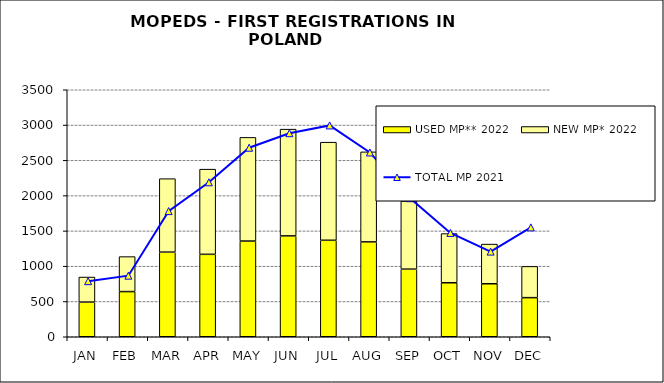
| Category | USED MP** 2022 | NEW MP* 2022 |
|---|---|---|
| JAN | 491 | 355 |
| FEB | 640 | 496 |
| MAR | 1199 | 1041 |
| APR | 1168 | 1207 |
| MAY | 1356 | 1469 |
| JUN | 1429 | 1513 |
| JUL | 1367 | 1390 |
| AUG | 1344 | 1276 |
| SEP | 958 | 965 |
| OCT | 765 | 697 |
| NOV | 751 | 562 |
| DEC | 554 | 443 |